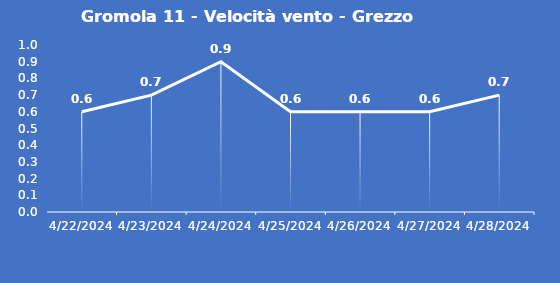
| Category | Gromola 11 - Velocità vento - Grezzo (m/s) |
|---|---|
| 4/22/24 | 0.6 |
| 4/23/24 | 0.7 |
| 4/24/24 | 0.9 |
| 4/25/24 | 0.6 |
| 4/26/24 | 0.6 |
| 4/27/24 | 0.6 |
| 4/28/24 | 0.7 |